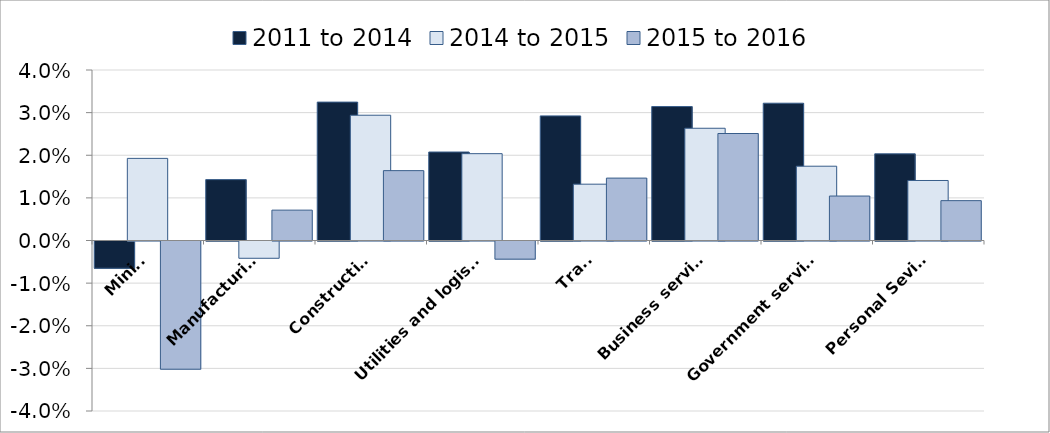
| Category | 2011 to 2014 | 2014 to 2015 | 2015 to 2016 |
|---|---|---|---|
| Mining | -0.006 | 0.019 | -0.03 |
| Manufacturing | 0.014 | -0.004 | 0.007 |
| Construction | 0.032 | 0.029 | 0.016 |
| Utilities and logistics | 0.021 | 0.02 | -0.004 |
| Trade | 0.029 | 0.013 | 0.015 |
| Business services | 0.031 | 0.026 | 0.025 |
| Government services | 0.032 | 0.017 | 0.01 |
| Personal Sevices | 0.02 | 0.014 | 0.009 |